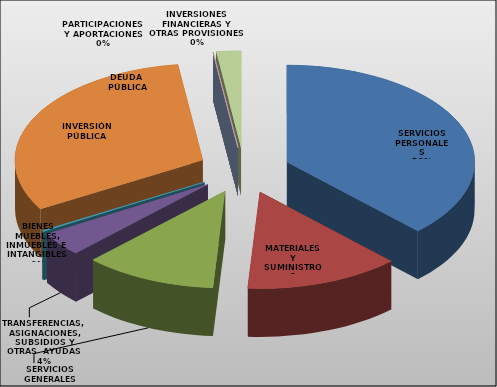
| Category | Series 0 |
|---|---|
| SERVICIOS PERSONALES | 30624123 |
| MATERIALES Y SUMINISTROS | 10841267 |
| SERVICIOS GENERALES | 9233554 |
| TRANSFERENCIAS, ASIGNACIONES, SUBSIDIOS Y OTRAS  AYUDAS | 3234761 |
| BIENES MUEBLES, INMUEBLES E  INTANGIBLES  | 159913 |
| INVERSIÓN PÚBLICA | 25428144 |
| INVERSIONES FINANCIERAS Y OTRAS PROVISIONES | 0 |
| PARTICIPACIONES Y APORTACIONES | 0 |
| DEUDA  PÚBLICA | 1721339 |